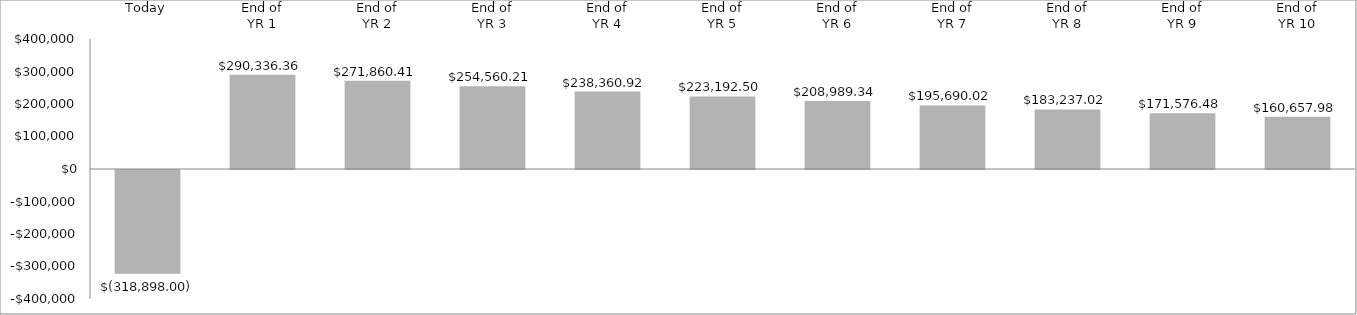
| Category |  $(318,898.00)  $290,336.36   $271,860.41   $254,560.21   $238,360.92   $223,192.50   $208,989.34   $195,690.02   $183,237.02   $171,576.48   $160,657.98  |
|---|---|
| Today | -318898 |
| End of_x000d_YR 1 | 290336.364 |
| End of_x000d_YR 2 | 271860.413 |
| End of_x000d_YR 3 | 254560.205 |
| End of_x000d_YR 4 | 238360.919 |
| End of_x000d_YR 5 | 223192.497 |
| End of_x000d_YR 6 | 208989.338 |
| End of_x000d_YR 7 | 195690.017 |
| End of_x000d_YR 8 | 183237.016 |
| End of_x000d_YR 9 | 171576.478 |
| End of_x000d_YR 10 | 160657.975 |